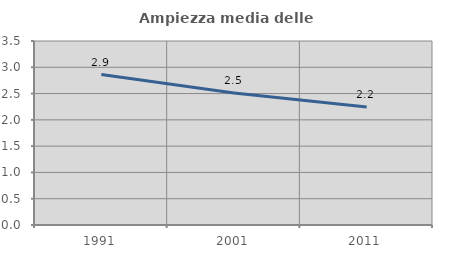
| Category | Ampiezza media delle famiglie |
|---|---|
| 1991.0 | 2.861 |
| 2001.0 | 2.511 |
| 2011.0 | 2.243 |